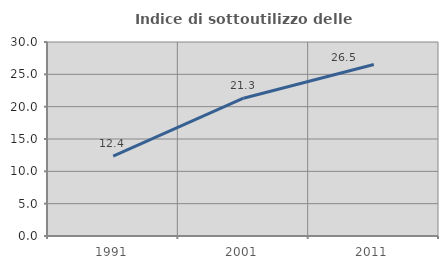
| Category | Indice di sottoutilizzo delle abitazioni  |
|---|---|
| 1991.0 | 12.353 |
| 2001.0 | 21.303 |
| 2011.0 | 26.52 |